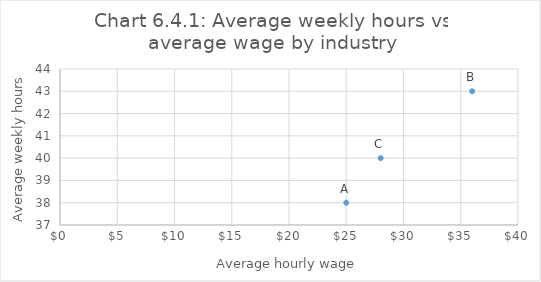
| Category | Average weekly hours |
|---|---|
| 25.0 | 38 |
| 36.0 | 43 |
| 28.0 | 40 |